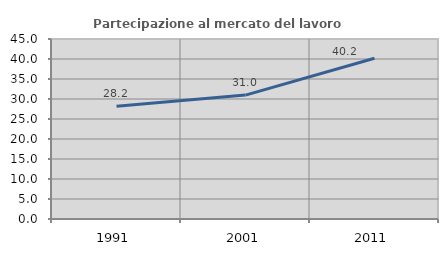
| Category | Partecipazione al mercato del lavoro  femminile |
|---|---|
| 1991.0 | 28.213 |
| 2001.0 | 30.981 |
| 2011.0 | 40.184 |